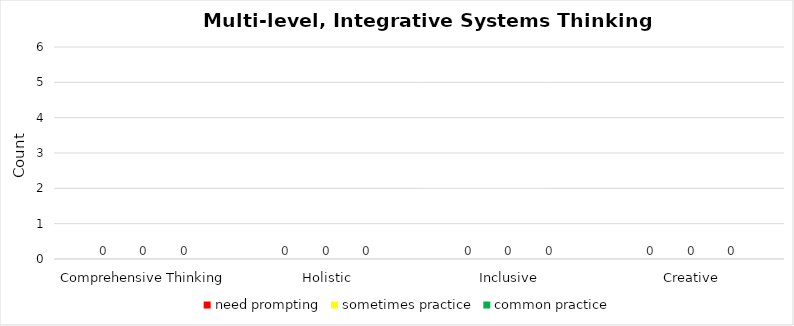
| Category | need prompting | sometimes practice | common practice |
|---|---|---|---|
| Comprehensive Thinking | 0 | 0 | 0 |
| Holistic | 0 | 0 | 0 |
| Inclusive | 0 | 0 | 0 |
| Creative | 0 | 0 | 0 |